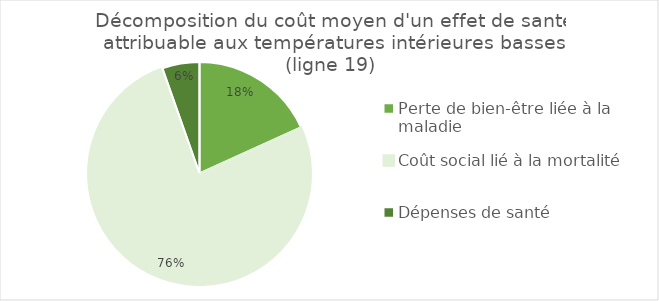
| Category | Series 0 |
|---|---|
| Perte de bien-être liée à la maladie | 24507.21 |
| Coût social lié à la mortalité | 102840 |
| Dépenses de santé | 7275.13 |